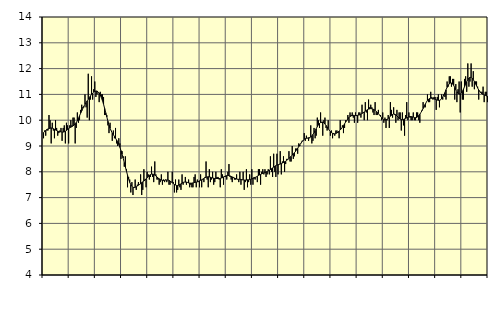
| Category | Byggverksamhet, SNI 41-43 | Series 1 |
|---|---|---|
| nan | 9.3 | 9.52 |
| 87.0 | 9.6 | 9.56 |
| 87.0 | 9.4 | 9.6 |
| 87.0 | 9.6 | 9.64 |
| 87.0 | 9.6 | 9.66 |
| 87.0 | 10.2 | 9.68 |
| 87.0 | 10 | 9.69 |
| 87.0 | 9.1 | 9.7 |
| 87.0 | 9.9 | 9.69 |
| 87.0 | 9.6 | 9.67 |
| 87.0 | 9.3 | 9.65 |
| 87.0 | 10 | 9.62 |
| nan | 9.7 | 9.6 |
| 88.0 | 9.4 | 9.58 |
| 88.0 | 9.5 | 9.56 |
| 88.0 | 9.6 | 9.55 |
| 88.0 | 9.7 | 9.55 |
| 88.0 | 9.2 | 9.54 |
| 88.0 | 9.7 | 9.54 |
| 88.0 | 9.8 | 9.55 |
| 88.0 | 9.1 | 9.57 |
| 88.0 | 9.9 | 9.6 |
| 88.0 | 9.8 | 9.64 |
| 88.0 | 9.1 | 9.67 |
| nan | 9.8 | 9.7 |
| 89.0 | 10 | 9.73 |
| 89.0 | 9.8 | 9.75 |
| 89.0 | 10.1 | 9.78 |
| 89.0 | 10.1 | 9.81 |
| 89.0 | 9.1 | 9.86 |
| 89.0 | 9.7 | 9.91 |
| 89.0 | 10.3 | 9.98 |
| 89.0 | 9.9 | 10.07 |
| 89.0 | 10 | 10.17 |
| 89.0 | 10.4 | 10.27 |
| 89.0 | 10.6 | 10.36 |
| nan | 10.5 | 10.46 |
| 90.0 | 10.5 | 10.54 |
| 90.0 | 11 | 10.62 |
| 90.0 | 10.5 | 10.68 |
| 90.0 | 10.1 | 10.75 |
| 90.0 | 11.8 | 10.81 |
| 90.0 | 10 | 10.88 |
| 90.0 | 10.8 | 10.94 |
| 90.0 | 11.7 | 11 |
| 90.0 | 10.8 | 11.05 |
| 90.0 | 11.2 | 11.09 |
| 90.0 | 11.5 | 11.12 |
| nan | 10.9 | 11.13 |
| 91.0 | 11 | 11.13 |
| 91.0 | 11.1 | 11.1 |
| 91.0 | 10.7 | 11.05 |
| 91.0 | 11.1 | 10.98 |
| 91.0 | 11 | 10.88 |
| 91.0 | 11 | 10.76 |
| 91.0 | 10.9 | 10.62 |
| 91.0 | 10.2 | 10.46 |
| 91.0 | 10.2 | 10.29 |
| 91.0 | 10.2 | 10.13 |
| 91.0 | 9.8 | 9.96 |
| nan | 9.5 | 9.81 |
| 92.0 | 9.9 | 9.69 |
| 92.0 | 9.6 | 9.59 |
| 92.0 | 9.2 | 9.5 |
| 92.0 | 9.6 | 9.44 |
| 92.0 | 9.3 | 9.37 |
| 92.0 | 9.7 | 9.3 |
| 92.0 | 9.1 | 9.23 |
| 92.0 | 9 | 9.15 |
| 92.0 | 9.3 | 9.06 |
| 92.0 | 9.1 | 8.95 |
| 92.0 | 8.5 | 8.82 |
| nan | 8.8 | 8.68 |
| 93.0 | 8.6 | 8.53 |
| 93.0 | 8.2 | 8.36 |
| 93.0 | 8.6 | 8.19 |
| 93.0 | 8.1 | 8.03 |
| 93.0 | 7.4 | 7.87 |
| 93.0 | 7.8 | 7.72 |
| 93.0 | 7.7 | 7.59 |
| 93.0 | 7.2 | 7.5 |
| 93.0 | 7.6 | 7.44 |
| 93.0 | 7.1 | 7.4 |
| 93.0 | 7.4 | 7.39 |
| nan | 7.7 | 7.4 |
| 94.0 | 7.3 | 7.42 |
| 94.0 | 7.5 | 7.45 |
| 94.0 | 7.6 | 7.48 |
| 94.0 | 7.5 | 7.51 |
| 94.0 | 7.9 | 7.54 |
| 94.0 | 7.1 | 7.58 |
| 94.0 | 7.3 | 7.61 |
| 94.0 | 8.1 | 7.64 |
| 94.0 | 7.7 | 7.68 |
| 94.0 | 7.4 | 7.73 |
| 94.0 | 8 | 7.77 |
| nan | 7.9 | 7.82 |
| 95.0 | 7.7 | 7.86 |
| 95.0 | 7.8 | 7.89 |
| 95.0 | 8.2 | 7.91 |
| 95.0 | 7.8 | 7.91 |
| 95.0 | 7.6 | 7.9 |
| 95.0 | 8.4 | 7.87 |
| 95.0 | 7.9 | 7.84 |
| 95.0 | 7.7 | 7.8 |
| 95.0 | 7.7 | 7.76 |
| 95.0 | 7.5 | 7.73 |
| 95.0 | 7.6 | 7.7 |
| nan | 7.9 | 7.68 |
| 96.0 | 7.5 | 7.67 |
| 96.0 | 7.7 | 7.66 |
| 96.0 | 7.6 | 7.67 |
| 96.0 | 7.7 | 7.68 |
| 96.0 | 7.6 | 7.68 |
| 96.0 | 8 | 7.68 |
| 96.0 | 7.5 | 7.67 |
| 96.0 | 7.5 | 7.64 |
| 96.0 | 7.6 | 7.61 |
| 96.0 | 8 | 7.58 |
| 96.0 | 7.6 | 7.54 |
| nan | 7.2 | 7.51 |
| 97.0 | 7.7 | 7.49 |
| 97.0 | 7.2 | 7.47 |
| 97.0 | 7.3 | 7.47 |
| 97.0 | 7.7 | 7.48 |
| 97.0 | 7.4 | 7.51 |
| 97.0 | 7.3 | 7.53 |
| 97.0 | 7.9 | 7.56 |
| 97.0 | 7.5 | 7.59 |
| 97.0 | 7.6 | 7.6 |
| 97.0 | 7.8 | 7.6 |
| 97.0 | 7.5 | 7.6 |
| nan | 7.6 | 7.59 |
| 98.0 | 7.7 | 7.57 |
| 98.0 | 7.4 | 7.56 |
| 98.0 | 7.5 | 7.56 |
| 98.0 | 7.4 | 7.56 |
| 98.0 | 7.4 | 7.57 |
| 98.0 | 7.8 | 7.58 |
| 98.0 | 7.9 | 7.59 |
| 98.0 | 7.4 | 7.6 |
| 98.0 | 7.7 | 7.61 |
| 98.0 | 7.6 | 7.63 |
| 98.0 | 7.4 | 7.65 |
| nan | 7.9 | 7.67 |
| 99.0 | 7.4 | 7.69 |
| 99.0 | 7.7 | 7.72 |
| 99.0 | 7.6 | 7.74 |
| 99.0 | 7.8 | 7.77 |
| 99.0 | 8.4 | 7.79 |
| 99.0 | 7.7 | 7.8 |
| 99.0 | 7.4 | 7.81 |
| 99.0 | 8.1 | 7.8 |
| 99.0 | 7.6 | 7.79 |
| 99.0 | 7.7 | 7.77 |
| 99.0 | 8 | 7.76 |
| nan | 7.5 | 7.75 |
| 0.0 | 7.6 | 7.74 |
| 0.0 | 8 | 7.74 |
| 0.0 | 7.8 | 7.74 |
| 0.0 | 7.8 | 7.74 |
| 0.0 | 7.7 | 7.74 |
| 0.0 | 7.4 | 7.74 |
| 0.0 | 8.1 | 7.76 |
| 0.0 | 7.9 | 7.77 |
| 0.0 | 7.5 | 7.8 |
| 0.0 | 7.8 | 7.82 |
| 0.0 | 7.8 | 7.84 |
| nan | 7.7 | 7.85 |
| 1.0 | 8 | 7.86 |
| 1.0 | 8.3 | 7.85 |
| 1.0 | 7.8 | 7.84 |
| 1.0 | 7.7 | 7.82 |
| 1.0 | 7.6 | 7.8 |
| 1.0 | 7.8 | 7.78 |
| 1.0 | 7.7 | 7.76 |
| 1.0 | 7.7 | 7.74 |
| 1.0 | 7.9 | 7.72 |
| 1.0 | 7.7 | 7.71 |
| 1.0 | 7.6 | 7.71 |
| nan | 8 | 7.71 |
| 2.0 | 7.5 | 7.7 |
| 2.0 | 7.7 | 7.69 |
| 2.0 | 8 | 7.69 |
| 2.0 | 7.3 | 7.68 |
| 2.0 | 7.6 | 7.68 |
| 2.0 | 8.1 | 7.68 |
| 2.0 | 7.4 | 7.69 |
| 2.0 | 7.6 | 7.69 |
| 2.0 | 7.9 | 7.7 |
| 2.0 | 7.5 | 7.71 |
| 2.0 | 8.1 | 7.72 |
| nan | 7.5 | 7.74 |
| 3.0 | 7.8 | 7.75 |
| 3.0 | 7.7 | 7.78 |
| 3.0 | 7.8 | 7.8 |
| 3.0 | 7.6 | 7.83 |
| 3.0 | 8.1 | 7.86 |
| 3.0 | 8.1 | 7.88 |
| 3.0 | 7.5 | 7.9 |
| 3.0 | 8 | 7.92 |
| 3.0 | 8.1 | 7.94 |
| 3.0 | 7.9 | 7.96 |
| 3.0 | 8.1 | 7.97 |
| nan | 7.8 | 7.99 |
| 4.0 | 7.9 | 8.01 |
| 4.0 | 8.1 | 8.04 |
| 4.0 | 7.9 | 8.06 |
| 4.0 | 8.6 | 8.09 |
| 4.0 | 8 | 8.12 |
| 4.0 | 7.8 | 8.15 |
| 4.0 | 8.7 | 8.18 |
| 4.0 | 8 | 8.21 |
| 4.0 | 7.8 | 8.24 |
| 4.0 | 8.7 | 8.26 |
| 4.0 | 7.9 | 8.27 |
| nan | 8.3 | 8.29 |
| 5.0 | 8.8 | 8.3 |
| 5.0 | 7.9 | 8.32 |
| 5.0 | 8.4 | 8.34 |
| 5.0 | 8.6 | 8.36 |
| 5.0 | 8 | 8.39 |
| 5.0 | 8.3 | 8.41 |
| 5.0 | 8.5 | 8.45 |
| 5.0 | 8.5 | 8.48 |
| 5.0 | 8.8 | 8.52 |
| 5.0 | 8.4 | 8.56 |
| 5.0 | 8.4 | 8.6 |
| nan | 9 | 8.65 |
| 6.0 | 8.5 | 8.69 |
| 6.0 | 8.6 | 8.74 |
| 6.0 | 8.9 | 8.79 |
| 6.0 | 8.9 | 8.85 |
| 6.0 | 8.7 | 8.91 |
| 6.0 | 9.1 | 8.98 |
| 6.0 | 9 | 9.05 |
| 6.0 | 9.1 | 9.11 |
| 6.0 | 9.2 | 9.17 |
| 6.0 | 9.2 | 9.22 |
| 6.0 | 9.5 | 9.26 |
| nan | 9.2 | 9.29 |
| 7.0 | 9.4 | 9.3 |
| 7.0 | 9.3 | 9.31 |
| 7.0 | 9.2 | 9.32 |
| 7.0 | 9.3 | 9.33 |
| 7.0 | 9.8 | 9.35 |
| 7.0 | 9.1 | 9.39 |
| 7.0 | 9.2 | 9.45 |
| 7.0 | 9.7 | 9.51 |
| 7.0 | 9.3 | 9.59 |
| 7.0 | 9.4 | 9.67 |
| 7.0 | 10.1 | 9.75 |
| nan | 10 | 9.82 |
| 8.0 | 9.7 | 9.87 |
| 8.0 | 10.3 | 9.91 |
| 8.0 | 9.9 | 9.93 |
| 8.0 | 9.4 | 9.93 |
| 8.0 | 10 | 9.9 |
| 8.0 | 10.1 | 9.85 |
| 8.0 | 9.7 | 9.8 |
| 8.0 | 9.6 | 9.74 |
| 8.0 | 10 | 9.67 |
| 8.0 | 9.6 | 9.61 |
| 8.0 | 9.4 | 9.56 |
| nan | 9.6 | 9.52 |
| 9.0 | 9.3 | 9.49 |
| 9.0 | 9.5 | 9.47 |
| 9.0 | 9.4 | 9.47 |
| 9.0 | 9.6 | 9.48 |
| 9.0 | 9.6 | 9.51 |
| 9.0 | 9.5 | 9.54 |
| 9.0 | 9.3 | 9.58 |
| 9.0 | 10 | 9.62 |
| 9.0 | 9.7 | 9.67 |
| 9.0 | 9.8 | 9.73 |
| 9.0 | 9.5 | 9.79 |
| nan | 9.7 | 9.86 |
| 10.0 | 10 | 9.93 |
| 10.0 | 10 | 9.99 |
| 10.0 | 10.2 | 10.05 |
| 10.0 | 9.9 | 10.11 |
| 10.0 | 10.3 | 10.14 |
| 10.0 | 10.2 | 10.17 |
| 10.0 | 10.3 | 10.18 |
| 10.0 | 10.1 | 10.19 |
| 10.0 | 9.9 | 10.18 |
| 10.0 | 10.3 | 10.18 |
| 10.0 | 10.2 | 10.18 |
| nan | 9.9 | 10.19 |
| 11.0 | 10.3 | 10.2 |
| 11.0 | 10.3 | 10.21 |
| 11.0 | 10.1 | 10.24 |
| 11.0 | 10.6 | 10.26 |
| 11.0 | 10.3 | 10.29 |
| 11.0 | 10 | 10.32 |
| 11.0 | 10.7 | 10.35 |
| 11.0 | 10.3 | 10.38 |
| 11.0 | 10 | 10.41 |
| 11.0 | 10.8 | 10.43 |
| 11.0 | 10.5 | 10.44 |
| nan | 10.6 | 10.45 |
| 12.0 | 10.5 | 10.44 |
| 12.0 | 10.3 | 10.43 |
| 12.0 | 10.2 | 10.41 |
| 12.0 | 10.7 | 10.38 |
| 12.0 | 10.2 | 10.34 |
| 12.0 | 10.2 | 10.3 |
| 12.0 | 10.4 | 10.26 |
| 12.0 | 10.2 | 10.2 |
| 12.0 | 10.2 | 10.15 |
| 12.0 | 10 | 10.1 |
| 12.0 | 10.3 | 10.06 |
| nan | 9.9 | 10.02 |
| 13.0 | 10.1 | 10.01 |
| 13.0 | 9.7 | 10.02 |
| 13.0 | 10 | 10.04 |
| 13.0 | 10.2 | 10.07 |
| 13.0 | 9.7 | 10.11 |
| 13.0 | 10.7 | 10.16 |
| 13.0 | 10.4 | 10.19 |
| 13.0 | 10.1 | 10.22 |
| 13.0 | 10.5 | 10.24 |
| 13.0 | 10.2 | 10.23 |
| 13.0 | 9.9 | 10.21 |
| nan | 10.4 | 10.17 |
| 14.0 | 10 | 10.12 |
| 14.0 | 10.3 | 10.08 |
| 14.0 | 10.3 | 10.04 |
| 14.0 | 9.6 | 10.03 |
| 14.0 | 10.3 | 10.02 |
| 14.0 | 9.8 | 10.03 |
| 14.0 | 9.4 | 10.05 |
| 14.0 | 10.2 | 10.07 |
| 14.0 | 10.7 | 10.09 |
| 14.0 | 10 | 10.11 |
| 14.0 | 10.3 | 10.13 |
| nan | 10.1 | 10.14 |
| 15.0 | 10 | 10.14 |
| 15.0 | 10 | 10.13 |
| 15.0 | 10.3 | 10.12 |
| 15.0 | 10 | 10.1 |
| 15.0 | 10 | 10.1 |
| 15.0 | 10.3 | 10.1 |
| 15.0 | 10.3 | 10.13 |
| 15.0 | 10 | 10.18 |
| 15.0 | 9.9 | 10.23 |
| 15.0 | 10.3 | 10.3 |
| 15.0 | 10.4 | 10.37 |
| nan | 10.7 | 10.45 |
| 16.0 | 10.5 | 10.54 |
| 16.0 | 10.5 | 10.62 |
| 16.0 | 10.7 | 10.7 |
| 16.0 | 11 | 10.77 |
| 16.0 | 10.7 | 10.81 |
| 16.0 | 10.7 | 10.84 |
| 16.0 | 11.1 | 10.85 |
| 16.0 | 10.9 | 10.85 |
| 16.0 | 10.8 | 10.84 |
| 16.0 | 10.9 | 10.83 |
| 16.0 | 10.9 | 10.81 |
| nan | 10.4 | 10.79 |
| 17.0 | 10.9 | 10.78 |
| 17.0 | 11 | 10.77 |
| 17.0 | 10.5 | 10.77 |
| 17.0 | 10.8 | 10.79 |
| 17.0 | 11 | 10.83 |
| 17.0 | 10.8 | 10.89 |
| 17.0 | 11 | 10.98 |
| 17.0 | 10.9 | 11.07 |
| 17.0 | 10.8 | 11.18 |
| 17.0 | 11.5 | 11.27 |
| 17.0 | 11.3 | 11.36 |
| nan | 11.7 | 11.41 |
| 18.0 | 11.7 | 11.44 |
| 18.0 | 11.3 | 11.44 |
| 18.0 | 11.6 | 11.41 |
| 18.0 | 11.6 | 11.35 |
| 18.0 | 10.8 | 11.27 |
| 18.0 | 11.4 | 11.18 |
| 18.0 | 10.7 | 11.1 |
| 18.0 | 11.2 | 11.04 |
| 18.0 | 11.5 | 11.01 |
| 18.0 | 10.3 | 11.02 |
| 18.0 | 11.5 | 11.05 |
| nan | 10.8 | 11.12 |
| 19.0 | 10.8 | 11.2 |
| 19.0 | 11.6 | 11.3 |
| 19.0 | 11.7 | 11.4 |
| 19.0 | 11.1 | 11.49 |
| 19.0 | 12.2 | 11.57 |
| 19.0 | 11.3 | 11.63 |
| 19.0 | 11.5 | 11.66 |
| 19.0 | 12.2 | 11.66 |
| 19.0 | 11.3 | 11.63 |
| 19.0 | 11.9 | 11.57 |
| 19.0 | 11.2 | 11.5 |
| nan | 11.5 | 11.41 |
| 20.0 | 11.5 | 11.33 |
| 20.0 | 11.3 | 11.25 |
| 20.0 | 10.8 | 11.17 |
| 20.0 | 11.1 | 11.11 |
| 20.0 | 11.1 | 11.06 |
| 20.0 | 11.1 | 11.02 |
| 20.0 | 11.3 | 11 |
| 20.0 | 10.7 | 10.97 |
| 20.0 | 11.1 | 10.96 |
| 20.0 | 11.1 | 10.94 |
| 20.0 | 10.7 | 10.93 |